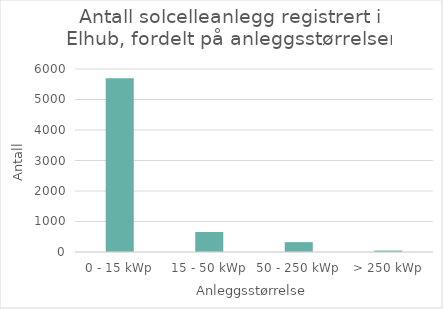
| Category | Antall |
|---|---|
| 0 - 15 kWp | 5698 |
| 15 - 50 kWp | 656 |
| 50 - 250 kWp | 324 |
| > 250 kWp | 47 |